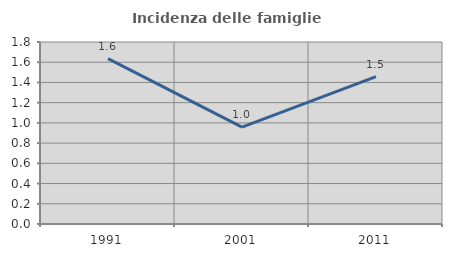
| Category | Incidenza delle famiglie numerose |
|---|---|
| 1991.0 | 1.636 |
| 2001.0 | 0.958 |
| 2011.0 | 1.457 |